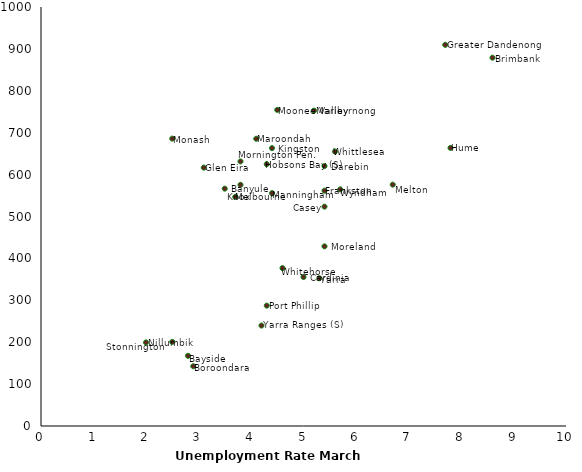
| Category | Unemployment Rate March 2019 |
|---|---|
| 3.5 | 566.487 |
| 2.8 | 167.5 |
| 2.9 | 142.598 |
| 8.6 | 879.041 |
| 5.0 | 355.534 |
| 5.4 | 523.531 |
| 5.4 | 620.436 |
| 5.4 | 561.639 |
| 3.1 | 616.725 |
| 7.7 | 909.71 |
| 4.3 | 624.91 |
| 7.8 | 663.777 |
| 4.4 | 663.159 |
| 3.8 | 575.685 |
| 4.4 | 555.697 |
| 5.2 | 752.672 |
| 4.1 | 685.565 |
| 3.7 | 546.739 |
| 6.7 | 575.983 |
| 2.5 | 685.908 |
| 4.5 | 754.414 |
| 5.4 | 428.754 |
| 3.8 | 631.387 |
| 2.0 | 199.463 |
| 4.3 | 287.287 |
| 2.5 | 200.702 |
| 4.6 | 376.926 |
| 5.6 | 655.091 |
| 5.7 | 564.792 |
| 5.3 | 352.664 |
| 4.2 | 239.728 |